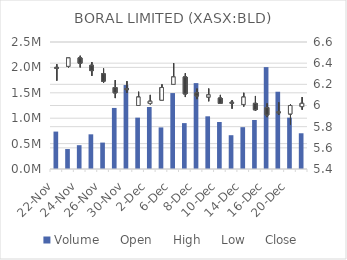
| Category | Volume |
|---|---|
| 2021-11-22 | 736628 |
| 2021-11-23 | 393026 |
| 2021-11-24 | 468824 |
| 2021-11-25 | 682670 |
| 2021-11-26 | 520033 |
| 2021-11-29 | 1201845 |
| 2021-11-30 | 1652969 |
| 2021-12-01 | 1010820 |
| 2021-12-02 | 1220916 |
| 2021-12-03 | 818535 |
| 2021-12-06 | 1494578 |
| 2021-12-07 | 903296 |
| 2021-12-08 | 1690685 |
| 2021-12-09 | 1037243 |
| 2021-12-10 | 924981 |
| 2021-12-13 | 665204 |
| 2021-12-14 | 823344 |
| 2021-12-15 | 964578 |
| 2021-12-16 | 2005773 |
| 2021-12-17 | 1520894 |
| 2021-12-20 | 1010684 |
| 2021-12-21 | 703484 |